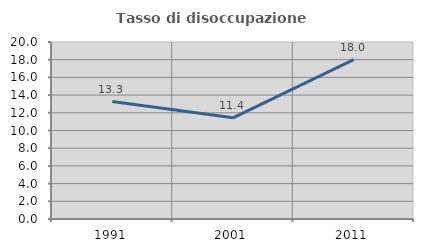
| Category | Tasso di disoccupazione giovanile  |
|---|---|
| 1991.0 | 13.274 |
| 2001.0 | 11.429 |
| 2011.0 | 18 |